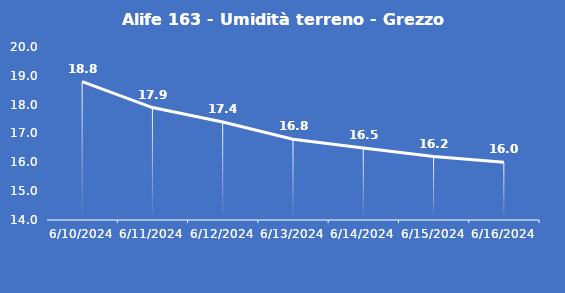
| Category | Alife 163 - Umidità terreno - Grezzo (%VWC) |
|---|---|
| 6/10/24 | 18.8 |
| 6/11/24 | 17.9 |
| 6/12/24 | 17.4 |
| 6/13/24 | 16.8 |
| 6/14/24 | 16.5 |
| 6/15/24 | 16.2 |
| 6/16/24 | 16 |